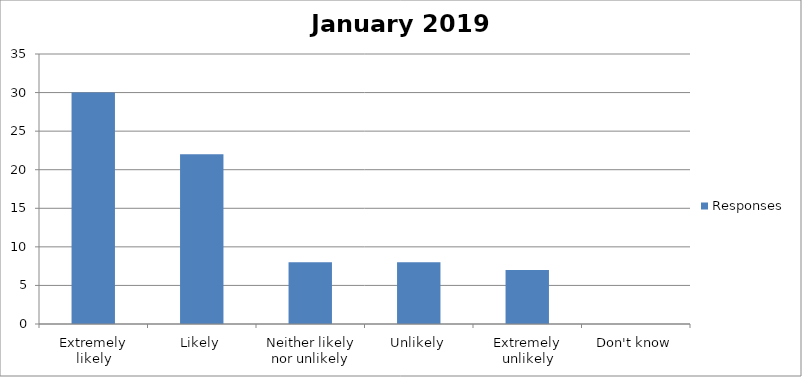
| Category | Responses |
|---|---|
| Extremely likely | 30 |
| Likely | 22 |
| Neither likely nor unlikely | 8 |
| Unlikely | 8 |
| Extremely unlikely | 7 |
| Don't know | 0 |